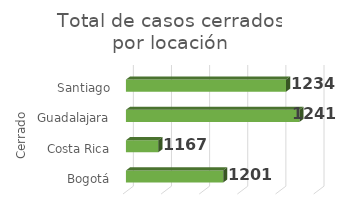
| Category | Total |
|---|---|
| 0 | 1201 |
| 1 | 1167 |
| 2 | 1241 |
| 3 | 1234 |